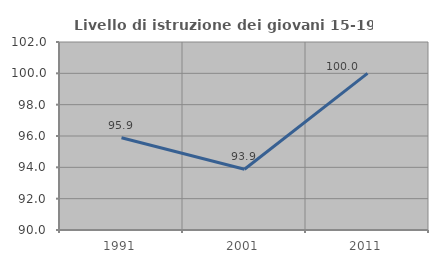
| Category | Livello di istruzione dei giovani 15-19 anni |
|---|---|
| 1991.0 | 95.89 |
| 2001.0 | 93.878 |
| 2011.0 | 100 |